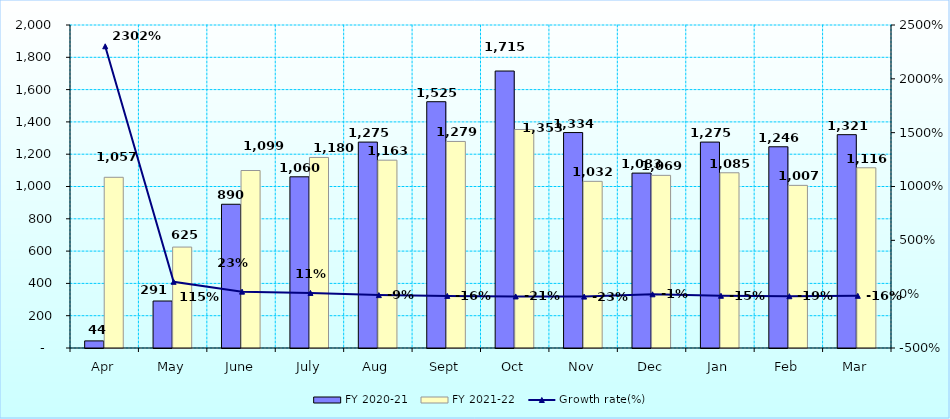
| Category | FY 2020-21 | FY 2021-22 |
|---|---|---|
| Apr | 44 | 1057 |
| May | 291 | 625 |
| June | 890 | 1099 |
| July | 1060 | 1180 |
| Aug | 1275 | 1163 |
| Sept | 1525 | 1279 |
| Oct | 1715 | 1353 |
| Nov | 1334 | 1032 |
| Dec | 1083 | 1069 |
| Jan | 1275 | 1085 |
| Feb | 1246 | 1007 |
| Mar | 1321 | 1116 |